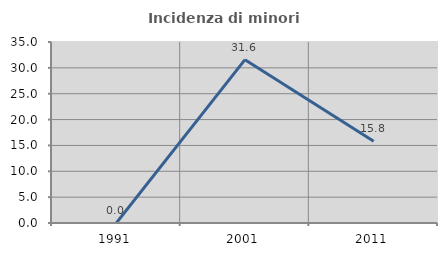
| Category | Incidenza di minori stranieri |
|---|---|
| 1991.0 | 0 |
| 2001.0 | 31.579 |
| 2011.0 | 15.789 |